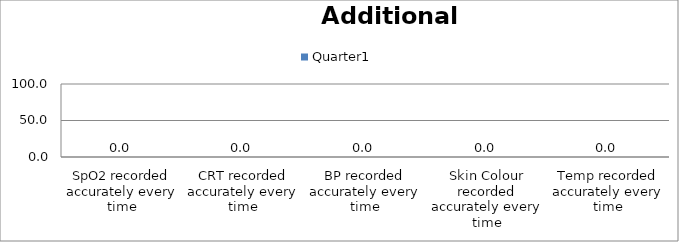
| Category | Quarter1 |
|---|---|
| SpO2 recorded accurately every time | 0 |
| CRT recorded accurately every time | 0 |
| BP recorded accurately every time | 0 |
| Skin Colour recorded accurately every time | 0 |
| Temp recorded accurately every time | 0 |